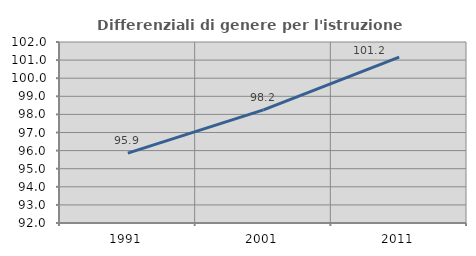
| Category | Differenziali di genere per l'istruzione superiore |
|---|---|
| 1991.0 | 95.862 |
| 2001.0 | 98.248 |
| 2011.0 | 101.165 |